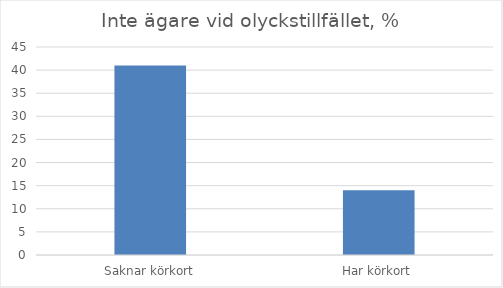
| Category | Andel icke- ägare |
|---|---|
| Saknar körkort | 41 |
| Har körkort | 14 |